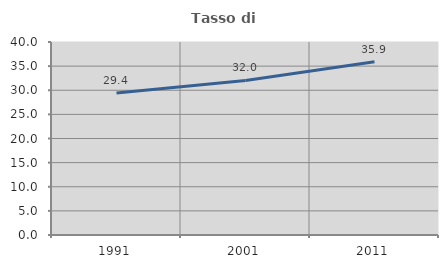
| Category | Tasso di occupazione   |
|---|---|
| 1991.0 | 29.431 |
| 2001.0 | 32.04 |
| 2011.0 | 35.917 |